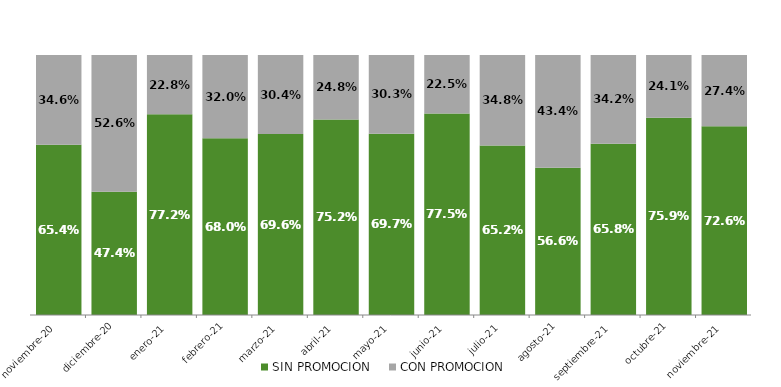
| Category | SIN PROMOCION   | CON PROMOCION   |
|---|---|---|
| 2020-11-01 | 0.654 | 0.346 |
| 2020-12-01 | 0.474 | 0.526 |
| 2021-01-01 | 0.772 | 0.228 |
| 2021-02-01 | 0.68 | 0.32 |
| 2021-03-01 | 0.696 | 0.304 |
| 2021-04-01 | 0.752 | 0.248 |
| 2021-05-01 | 0.697 | 0.303 |
| 2021-06-01 | 0.775 | 0.225 |
| 2021-07-01 | 0.652 | 0.348 |
| 2021-08-01 | 0.566 | 0.434 |
| 2021-09-01 | 0.658 | 0.342 |
| 2021-10-01 | 0.759 | 0.241 |
| 2021-11-01 | 0.726 | 0.274 |